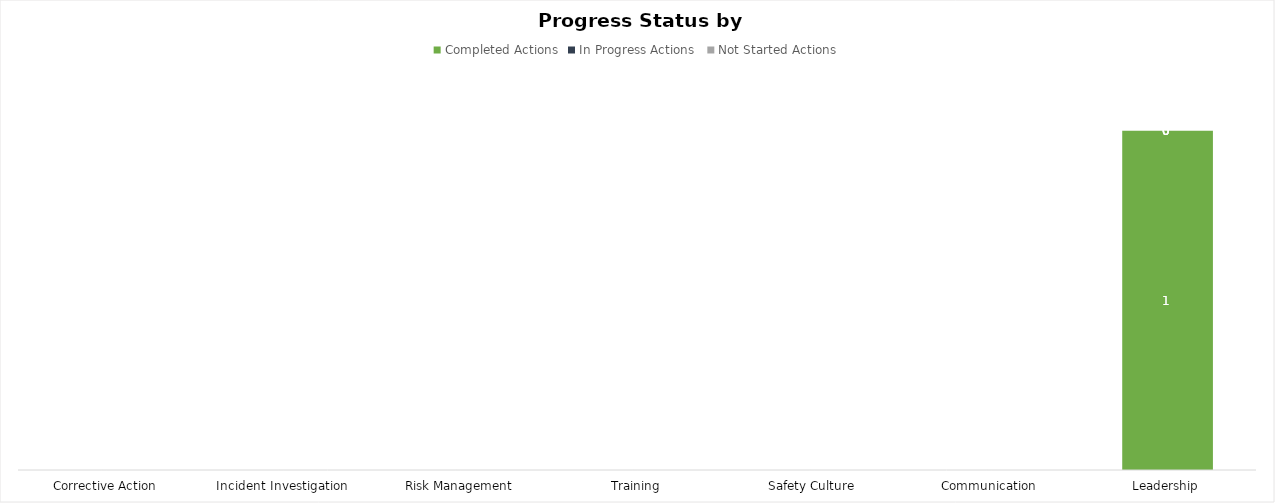
| Category | Completed Actions | In Progress Actions  | Not Started Actions |
|---|---|---|---|
| Corrective Action | 0 | 0 | 0 |
| Incident Investigation | 0 | 0 | 0 |
| Risk Management | 0 | 0 | 0 |
| Training | 0 | 0 | 0 |
| Safety Culture | 0 | 0 | 0 |
| Communication | 0 | 0 | 0 |
| Leadership | 1 | 0 | 0 |